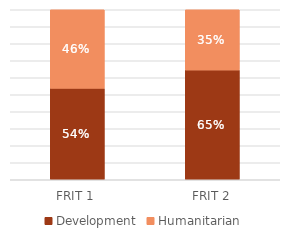
| Category | Development | Humanitarian |
|---|---|---|
| FRIT 1 | 0.538 | 0.462 |
| FRIT 2 | 0.646 | 0.354 |